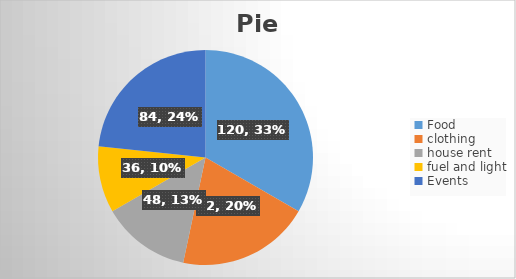
| Category | Expenditures |
|---|---|
| Food | 120 |
| clothing | 72 |
| house rent | 48 |
| fuel and light | 36 |
| Events | 84 |